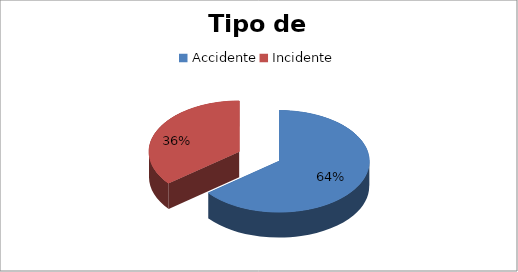
| Category | Cant. |
|---|---|
| Accidente | 9 |
| Incidente | 5 |